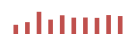
| Category | Importações (2) |
|---|---|
| 2007.0 | 575.605 |
| 2008.0 | 741.035 |
| 2009.0 | 1388.881 |
| 2010.0 | 899.436 |
| 2011.0 | 1170.349 |